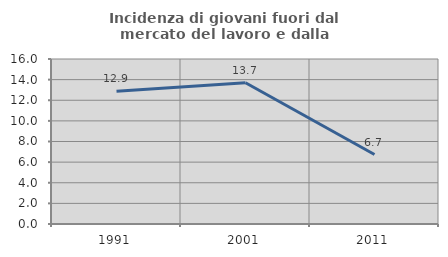
| Category | Incidenza di giovani fuori dal mercato del lavoro e dalla formazione  |
|---|---|
| 1991.0 | 12.882 |
| 2001.0 | 13.696 |
| 2011.0 | 6.734 |